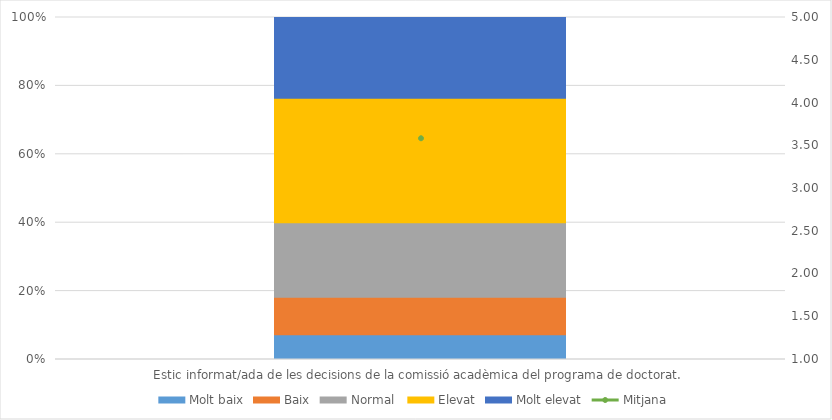
| Category | Molt baix | Baix | Normal  | Elevat | Molt elevat |
|---|---|---|---|---|---|
| Estic informat/ada de les decisions de la comissió acadèmica del programa de doctorat. | 4 | 6 | 12 | 20 | 13 |